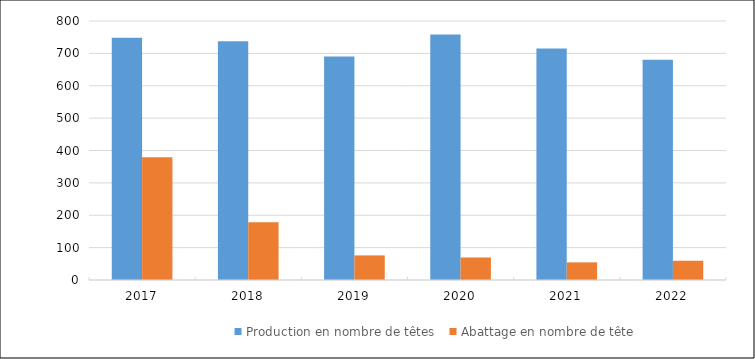
| Category | Production en nombre de têtes | Abattage en nombre de tête |
|---|---|---|
| 2017.0 | 748590 | 379436 |
| 2018.0 | 737650 | 178633 |
| 2019.0 | 690510 | 75982 |
| 2020.0 | 758427 | 69574 |
| 2021.0 | 714729 | 54475 |
| 2022.0 | 680550 | 59520 |